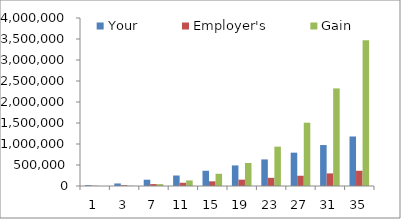
| Category | Your | Employer's | Gain |
|---|---|---|---|
| 1.0 | 19500 | 6000 | 0 |
| 3.0 | 60272.55 | 18545.4 | 5533.5 |
| 7.0 | 149418.013 | 45974.773 | 44248.316 |
| 11.0 | 249752.016 | 76846.774 | 132795.237 |
| 15.0 | 362678.821 | 111593.483 | 291406.075 |
| 19.0 | 489778.935 | 150701.211 | 547196.05 |
| 23.0 | 632831.232 | 194717.302 | 936377.852 |
| 27.0 | 793837.854 | 244257.801 | 1507173.218 |
| 31.0 | 975052.224 | 300016.069 | 2323639.957 |
| 35.0 | 1179010.595 | 362772.491 | 3470700.296 |